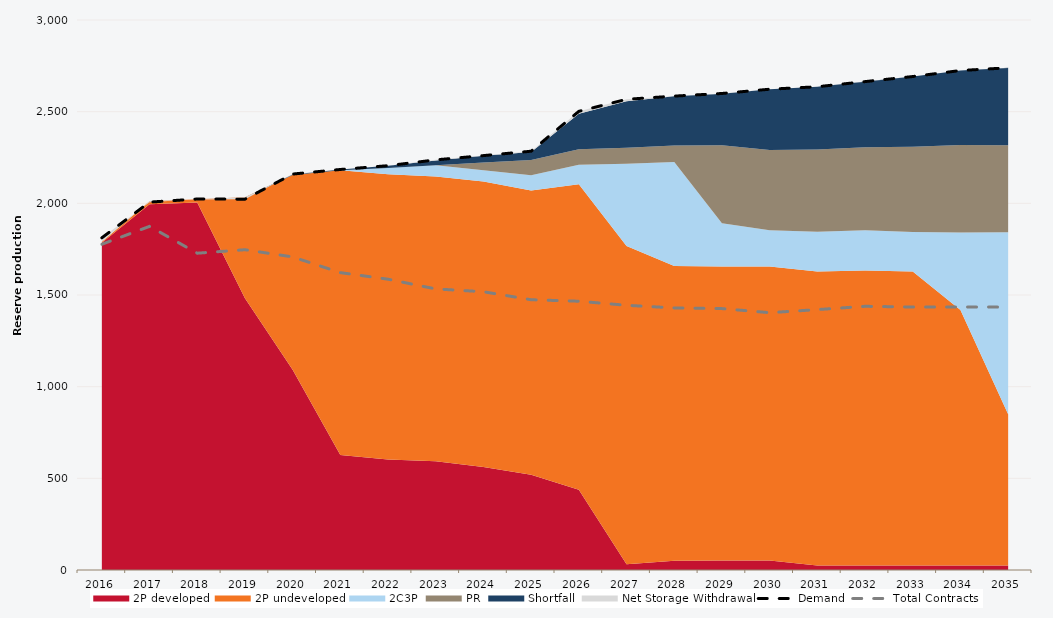
| Category | Demand | Total Contracts |
|---|---|---|
| 0 | 1811.89 | 1776.781 |
| 1 | 2006.629 | 1874.371 |
| 2 | 2023.523 | 1727.997 |
| 3 | 2022.764 | 1746.967 |
| 4 | 2159.645 | 1707.643 |
| 5 | 2184.714 | 1621.977 |
| 6 | 2205.394 | 1586.126 |
| 7 | 2237.121 | 1533.126 |
| 8 | 2260.345 | 1517.777 |
| 9 | 2284.261 | 1474.136 |
| 10 | 2501.787 | 1466.013 |
| 11 | 2567.409 | 1443.817 |
| 12 | 2584.847 | 1429.645 |
| 13 | 2599.185 | 1425.788 |
| 14 | 2622.447 | 1403.548 |
| 15 | 2635.913 | 1420.349 |
| 16 | 2663.946 | 1438.314 |
| 17 | 2691.638 | 1434.467 |
| 18 | 2724.4 | 1434.453 |
| 19 | 2739.171 | 1434.032 |